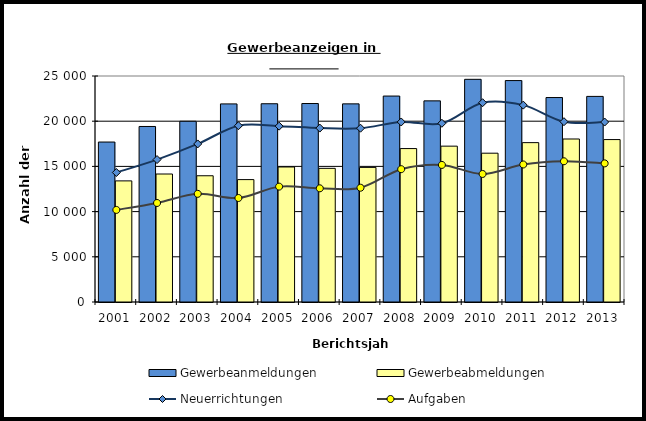
| Category | Gewerbeanmeldungen | Gewerbeabmeldungen |
|---|---|---|
| 2001.0 | 17694 | 13398 |
| 2002.0 | 19416 | 14158 |
| 2003.0 | 19992 | 13964 |
| 2004.0 | 21914 | 13540 |
| 2005.0 | 21931 | 14936 |
| 2006.0 | 21955 | 14785 |
| 2007.0 | 21918 | 14890 |
| 2008.0 | 22781 | 16972 |
| 2009.0 | 22250 | 17240 |
| 2010.0 | 24632 | 16460 |
| 2011.0 | 24495 | 17629 |
| 2012.0 | 22618 | 18032 |
| 2013.0 | 22743 | 17968 |